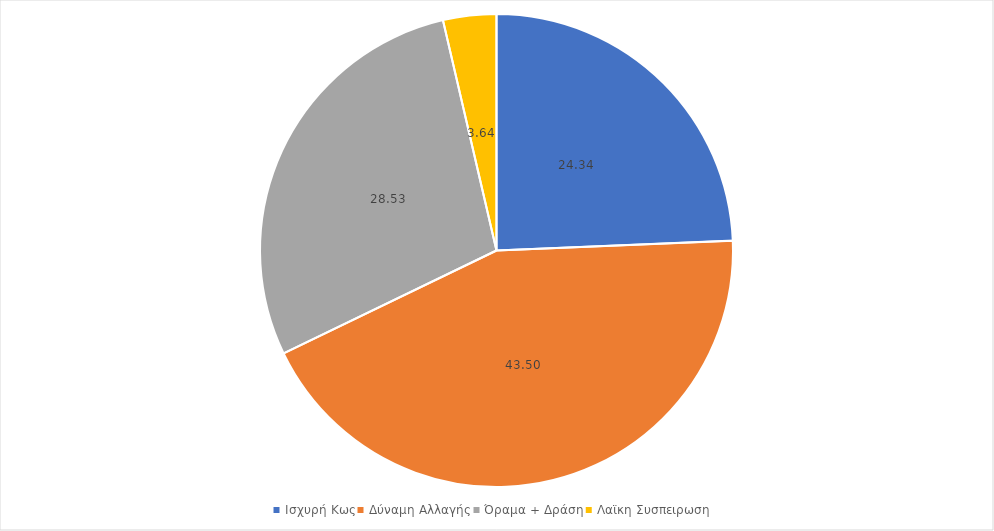
| Category | Series 0 |
|---|---|
| Ισχυρή Κως | 24.336 |
| Δύναμη Αλλαγής | 43.497 |
| Όραμα + Δράση | 28.531 |
| Λαϊκη Συσπειρωση | 3.636 |